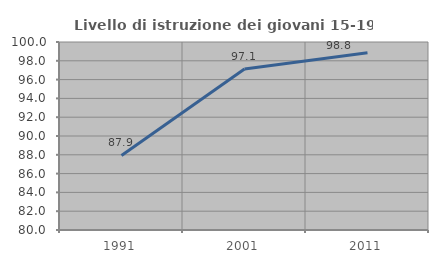
| Category | Livello di istruzione dei giovani 15-19 anni |
|---|---|
| 1991.0 | 87.926 |
| 2001.0 | 97.13 |
| 2011.0 | 98.846 |